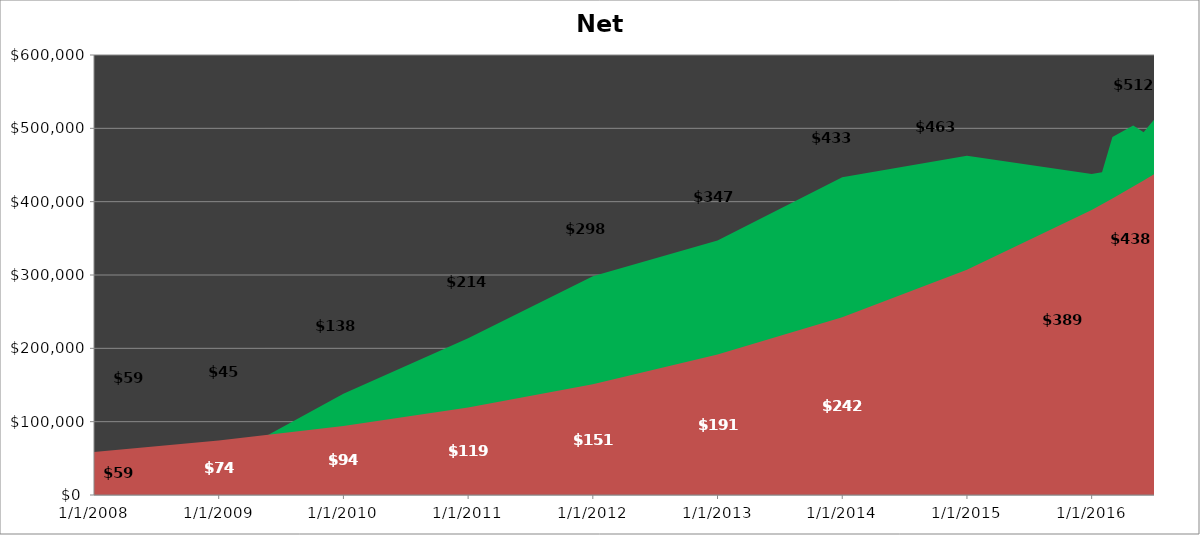
| Category | Net Worth | Comp |
|---|---|---|
| 1/31/08 | 58769.65 | 58769.65 |
| 1/31/09 | 45070.34 | 74425.829 |
| 1/31/10 | 138033.98 | 94252.798 |
| 1/31/11 | 213832.79 | 119361.654 |
| 1/31/12 | 298449.9 | 151159.485 |
| 1/31/13 | 346969.28 | 191428.227 |
| 1/31/14 | 433149.74 | 242424.524 |
| 1/31/15 | 462741.66 | 307006.186 |
| 1/31/16 | 437562.07 | 388792.341 |
| 2/28/16 | 440023.4 | 396520.139 |
| 3/30/16 | 488217.2 | 404401.537 |
| 4/30/16 | 496016.17 | 412439.589 |
| 5/31/16 | 503939.92 | 420637.408 |
| 6/30/16 | 494758.25 | 428998.171 |
| 7/31/16 | 511782.6 | 437525.116 |